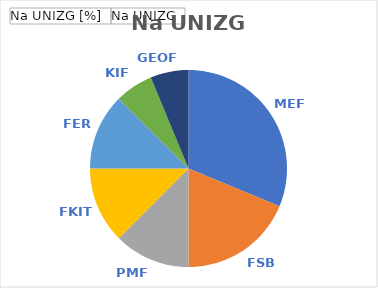
| Category | Na UNIZG [%] | Na UNIZG |
|---|---|---|
| MEF | 0.312 | 5 |
| FSB | 0.188 | 3 |
| PMF | 0.125 | 2 |
| FKIT | 0.125 | 2 |
| FER | 0.125 | 2 |
| KIF | 0.062 | 1 |
| GEOF | 0.062 | 1 |